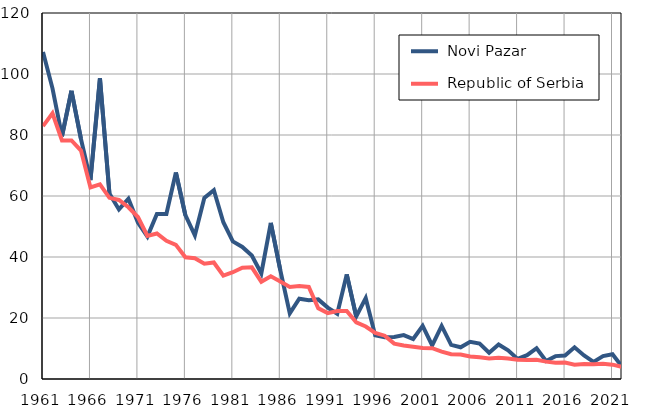
| Category |  Novi Pazar |  Republic of Serbia |
|---|---|---|
| 1961.0 | 107.2 | 82.9 |
| 1962.0 | 95.3 | 87.1 |
| 1963.0 | 79.6 | 78.2 |
| 1964.0 | 94.5 | 78.2 |
| 1965.0 | 78.7 | 74.9 |
| 1966.0 | 65.2 | 62.8 |
| 1967.0 | 98.6 | 63.8 |
| 1968.0 | 60.8 | 59.4 |
| 1969.0 | 55.6 | 58.7 |
| 1970.0 | 59.1 | 56.3 |
| 1971.0 | 51.3 | 53.1 |
| 1972.0 | 46.7 | 46.9 |
| 1973.0 | 54.1 | 47.7 |
| 1974.0 | 54.1 | 45.3 |
| 1975.0 | 67.7 | 44 |
| 1976.0 | 53.7 | 39.9 |
| 1977.0 | 47.1 | 39.6 |
| 1978.0 | 59.4 | 37.8 |
| 1979.0 | 61.9 | 38.2 |
| 1980.0 | 51.4 | 33.9 |
| 1981.0 | 45.1 | 35 |
| 1982.0 | 43.3 | 36.5 |
| 1983.0 | 40.5 | 36.6 |
| 1984.0 | 34.6 | 31.9 |
| 1985.0 | 51.2 | 33.7 |
| 1986.0 | 35.7 | 32 |
| 1987.0 | 21.5 | 30.2 |
| 1988.0 | 26.3 | 30.5 |
| 1989.0 | 25.8 | 30.2 |
| 1990.0 | 26.1 | 23.2 |
| 1991.0 | 23.4 | 21.6 |
| 1992.0 | 21.4 | 22.3 |
| 1993.0 | 34.3 | 22.3 |
| 1994.0 | 20.5 | 18.6 |
| 1995.0 | 26.5 | 17.2 |
| 1996.0 | 14.3 | 15.1 |
| 1997.0 | 13.7 | 14.2 |
| 1998.0 | 13.8 | 11.6 |
| 1999.0 | 14.4 | 11 |
| 2000.0 | 13.1 | 10.6 |
| 2001.0 | 17.4 | 10.2 |
| 2002.0 | 11 | 10.1 |
| 2003.0 | 17.4 | 9 |
| 2004.0 | 11.2 | 8.1 |
| 2005.0 | 10.4 | 8 |
| 2006.0 | 12.2 | 7.4 |
| 2007.0 | 11.6 | 7.1 |
| 2008.0 | 8.6 | 6.7 |
| 2009.0 | 11.3 | 7 |
| 2010.0 | 9.4 | 6.7 |
| 2011.0 | 6.6 | 6.3 |
| 2012.0 | 7.8 | 6.2 |
| 2013.0 | 10.1 | 6.3 |
| 2014.0 | 5.9 | 5.7 |
| 2015.0 | 7.5 | 5.3 |
| 2016.0 | 7.7 | 5.4 |
| 2017.0 | 10.4 | 4.7 |
| 2018.0 | 7.7 | 4.9 |
| 2019.0 | 5.6 | 4.8 |
| 2020.0 | 7.5 | 5 |
| 2021.0 | 8.1 | 4.7 |
| 2022.0 | 4.1 | 4 |